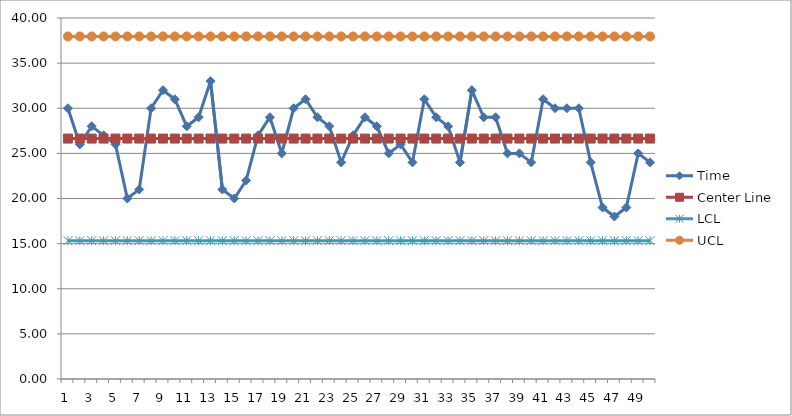
| Category | Time | Center Line | delta from mean (xi - u) | delta from mean squared(xi-u)^2 | LCL | UCL |
|---|---|---|---|---|---|---|
| 0 | 30 | 26.64 |  |  | 15.323 | 37.957 |
| 1 | 26 | 26.64 |  |  | 15.323 | 37.957 |
| 2 | 28 | 26.64 |  |  | 15.323 | 37.957 |
| 3 | 27 | 26.64 |  |  | 15.323 | 37.957 |
| 4 | 26 | 26.64 |  |  | 15.323 | 37.957 |
| 5 | 20 | 26.64 |  |  | 15.323 | 37.957 |
| 6 | 21 | 26.64 |  |  | 15.323 | 37.957 |
| 7 | 30 | 26.64 |  |  | 15.323 | 37.957 |
| 8 | 32 | 26.64 |  |  | 15.323 | 37.957 |
| 9 | 31 | 26.64 |  |  | 15.323 | 37.957 |
| 10 | 28 | 26.64 |  |  | 15.323 | 37.957 |
| 11 | 29 | 26.64 |  |  | 15.323 | 37.957 |
| 12 | 33 | 26.64 |  |  | 15.323 | 37.957 |
| 13 | 21 | 26.64 |  |  | 15.323 | 37.957 |
| 14 | 20 | 26.64 |  |  | 15.323 | 37.957 |
| 15 | 22 | 26.64 |  |  | 15.323 | 37.957 |
| 16 | 27 | 26.64 |  |  | 15.323 | 37.957 |
| 17 | 29 | 26.64 |  |  | 15.323 | 37.957 |
| 18 | 25 | 26.64 |  |  | 15.323 | 37.957 |
| 19 | 30 | 26.64 |  |  | 15.323 | 37.957 |
| 20 | 31 | 26.64 |  |  | 15.323 | 37.957 |
| 21 | 29 | 26.64 |  |  | 15.323 | 37.957 |
| 22 | 28 | 26.64 |  |  | 15.323 | 37.957 |
| 23 | 24 | 26.64 |  |  | 15.323 | 37.957 |
| 24 | 27 | 26.64 |  |  | 15.323 | 37.957 |
| 25 | 29 | 26.64 |  |  | 15.323 | 37.957 |
| 26 | 28 | 26.64 |  |  | 15.323 | 37.957 |
| 27 | 25 | 26.64 |  |  | 15.323 | 37.957 |
| 28 | 26 | 26.64 |  |  | 15.323 | 37.957 |
| 29 | 24 | 26.64 |  |  | 15.323 | 37.957 |
| 30 | 31 | 26.64 |  |  | 15.323 | 37.957 |
| 31 | 29 | 26.64 |  |  | 15.323 | 37.957 |
| 32 | 28 | 26.64 |  |  | 15.323 | 37.957 |
| 33 | 24 | 26.64 |  |  | 15.323 | 37.957 |
| 34 | 32 | 26.64 |  |  | 15.323 | 37.957 |
| 35 | 29 | 26.64 |  |  | 15.323 | 37.957 |
| 36 | 29 | 26.64 |  |  | 15.323 | 37.957 |
| 37 | 25 | 26.64 |  |  | 15.323 | 37.957 |
| 38 | 25 | 26.64 |  |  | 15.323 | 37.957 |
| 39 | 24 | 26.64 |  |  | 15.323 | 37.957 |
| 40 | 31 | 26.64 |  |  | 15.323 | 37.957 |
| 41 | 30 | 26.64 |  |  | 15.323 | 37.957 |
| 42 | 30 | 26.64 |  |  | 15.323 | 37.957 |
| 43 | 30 | 26.64 |  |  | 15.323 | 37.957 |
| 44 | 24 | 26.64 |  |  | 15.323 | 37.957 |
| 45 | 19 | 26.64 |  |  | 15.323 | 37.957 |
| 46 | 18 | 26.64 |  |  | 15.323 | 37.957 |
| 47 | 19 | 26.64 |  |  | 15.323 | 37.957 |
| 48 | 25 | 26.64 |  |  | 15.323 | 37.957 |
| 49 | 24 | 26.64 |  |  | 15.323 | 37.957 |